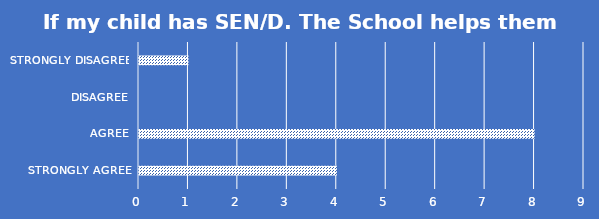
| Category | Series 1 |
|---|---|
| Strongly agree | 4 |
| Agree | 8 |
| Disagree | 0 |
| Strongly disagree | 1 |